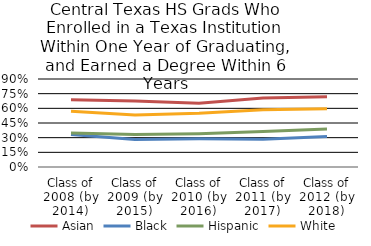
| Category | Asian | Black | Hispanic | White |
|---|---|---|---|---|
| Class of 2008 (by 2014) | 0.688 | 0.332 | 0.347 | 0.571 |
| Class of 2009 (by 2015) | 0.675 | 0.282 | 0.332 | 0.532 |
| Class of 2010 (by 2016) | 0.653 | 0.29 | 0.34 | 0.549 |
| Class of 2011 (by 2017) | 0.705 | 0.285 | 0.362 | 0.585 |
| Class of 2012 (by 2018) | 0.719 | 0.312 | 0.388 | 0.595 |